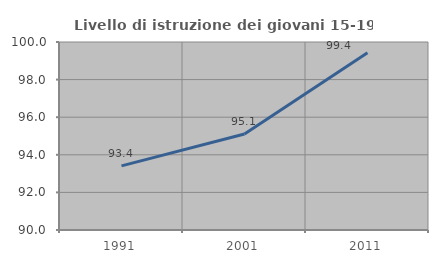
| Category | Livello di istruzione dei giovani 15-19 anni |
|---|---|
| 1991.0 | 93.413 |
| 2001.0 | 95.109 |
| 2011.0 | 99.433 |